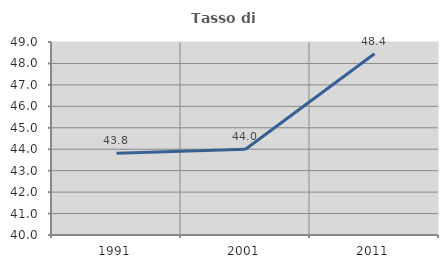
| Category | Tasso di occupazione   |
|---|---|
| 1991.0 | 43.811 |
| 2001.0 | 44 |
| 2011.0 | 48.45 |